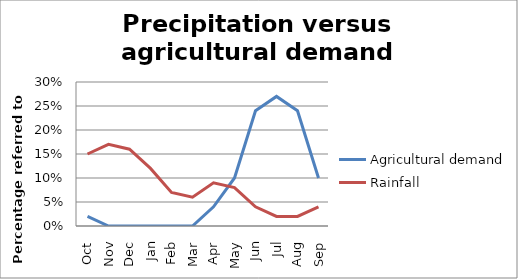
| Category | Agricultural demand | Rainfall |
|---|---|---|
| Oct | 0.02 | 0.15 |
| Nov | 0 | 0.17 |
| Dec | 0 | 0.16 |
| Jan | 0 | 0.12 |
| Feb | 0 | 0.07 |
| Mar | 0 | 0.06 |
| Apr | 0.04 | 0.09 |
| May | 0.1 | 0.08 |
| Jun | 0.24 | 0.04 |
| Jul | 0.27 | 0.02 |
| Aug | 0.24 | 0.02 |
| Sep | 0.1 | 0.04 |